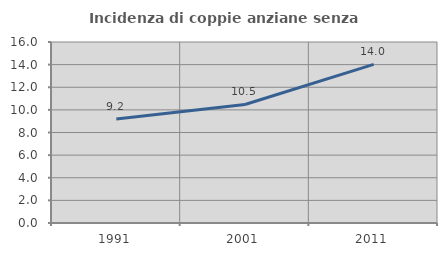
| Category | Incidenza di coppie anziane senza figli  |
|---|---|
| 1991.0 | 9.193 |
| 2001.0 | 10.477 |
| 2011.0 | 14.025 |